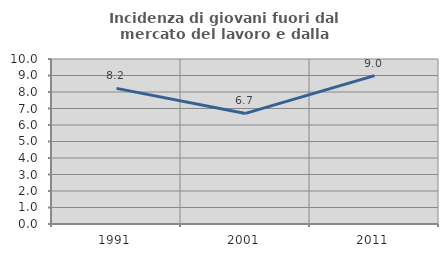
| Category | Incidenza di giovani fuori dal mercato del lavoro e dalla formazione  |
|---|---|
| 1991.0 | 8.221 |
| 2001.0 | 6.702 |
| 2011.0 | 8.996 |